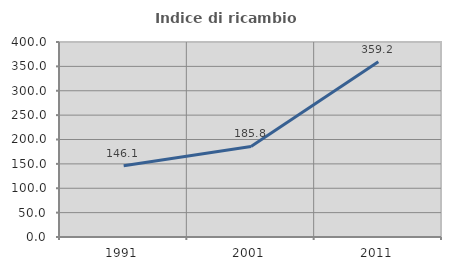
| Category | Indice di ricambio occupazionale  |
|---|---|
| 1991.0 | 146.08 |
| 2001.0 | 185.818 |
| 2011.0 | 359.233 |